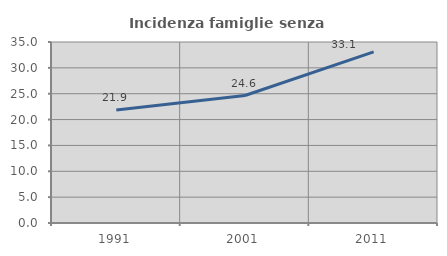
| Category | Incidenza famiglie senza nuclei |
|---|---|
| 1991.0 | 21.852 |
| 2001.0 | 24.649 |
| 2011.0 | 33.092 |